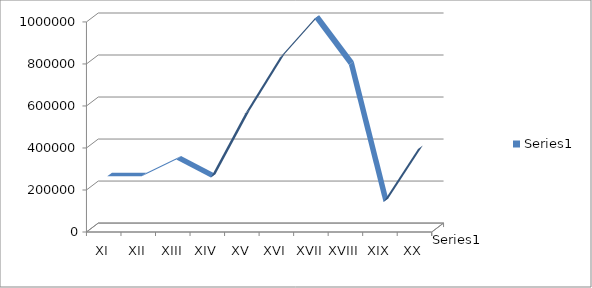
| Category | Series 0 |
|---|---|
| XI | 250000 |
| XII | 250000 |
| XIII | 330000 |
| XIV | 244000 |
| XV | 550000 |
| XVI | 815000 |
| XVII | 1000000 |
| XVIII | 780000 |
| XIX | 127000 |
| XX | 380000 |